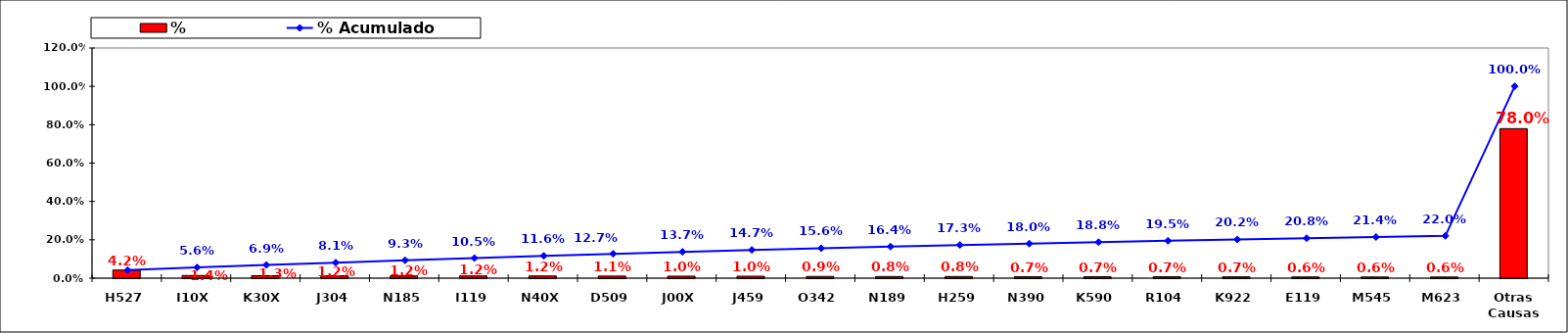
| Category | % |
|---|---|
| H527 | 0.042 |
| I10X | 0.014 |
| K30X | 0.013 |
| J304 | 0.012 |
| N185 | 0.012 |
| I119 | 0.012 |
| N40X | 0.012 |
| D509 | 0.011 |
| J00X | 0.01 |
| J459 | 0.01 |
| O342 | 0.009 |
| N189 | 0.008 |
| H259 | 0.008 |
| N390 | 0.007 |
| K590 | 0.007 |
| R104 | 0.007 |
| K922 | 0.007 |
| E119 | 0.006 |
| M545 | 0.006 |
| M623 | 0.006 |
| Otras Causas | 0.78 |